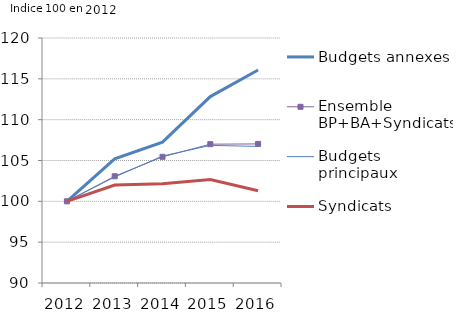
| Category | Budgets annexes | Ensemble BP+BA+Syndicats | Budgets principaux | Syndicats  |
|---|---|---|---|---|
| 2012.0 | 100 | 100 | 100 | 100 |
| 2013.0 | 105.208 | 103.071 | 102.98 | 101.997 |
| 2014.0 | 107.244 | 105.45 | 105.542 | 102.152 |
| 2015.0 | 112.827 | 106.999 | 106.85 | 102.658 |
| 2016.0 | 116.081 | 107.032 | 106.73 | 101.293 |